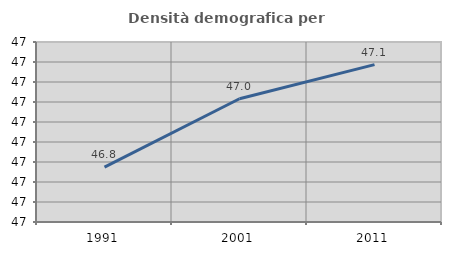
| Category | Densità demografica |
|---|---|
| 1991.0 | 46.837 |
| 2001.0 | 47.008 |
| 2011.0 | 47.093 |